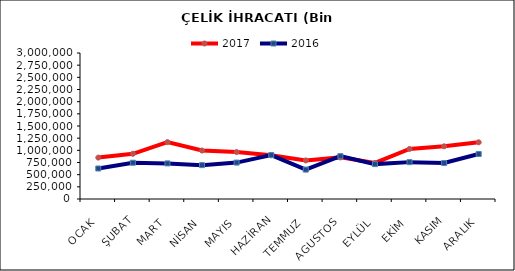
| Category | 2017 | 2016 |
|---|---|---|
| OCAK | 850631.402 | 626923.534 |
| ŞUBAT | 928852.77 | 744873.264 |
| MART | 1169238.04 | 731676.111 |
| NİSAN | 995623.603 | 695900.644 |
| MAYIS | 965119.632 | 748294.699 |
| HAZİRAN | 897081.597 | 903306.155 |
| TEMMUZ | 792857.234 | 603972.51 |
| AGUSTOS | 855037.57 | 880299.908 |
| EYLÜL | 740592.095 | 716701.932 |
| EKİM | 1029236.729 | 757668.325 |
| KASIM | 1082661.222 | 739254.847 |
| ARALIK | 1165011.647 | 924330.982 |